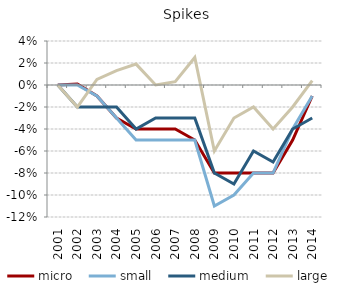
| Category | micro | small | medium | large |
|---|---|---|---|---|
| 2001.0 | 0 | 0 | 0 | 0 |
| 2002.0 | 0.001 | 0 | -0.02 | -0.02 |
| 2003.0 | -0.01 | -0.01 | -0.02 | 0.005 |
| 2004.0 | -0.03 | -0.03 | -0.02 | 0.013 |
| 2005.0 | -0.04 | -0.05 | -0.04 | 0.019 |
| 2006.0 | -0.04 | -0.05 | -0.03 | 0 |
| 2007.0 | -0.04 | -0.05 | -0.03 | 0.003 |
| 2008.0 | -0.05 | -0.05 | -0.03 | 0.025 |
| 2009.0 | -0.08 | -0.11 | -0.08 | -0.06 |
| 2010.0 | -0.08 | -0.1 | -0.09 | -0.03 |
| 2011.0 | -0.08 | -0.08 | -0.06 | -0.02 |
| 2012.0 | -0.08 | -0.08 | -0.07 | -0.04 |
| 2013.0 | -0.05 | -0.04 | -0.04 | -0.02 |
| 2014.0 | -0.01 | -0.01 | -0.03 | 0.004 |